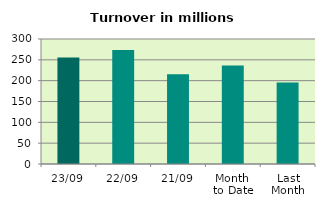
| Category | Series 0 |
|---|---|
| 23/09 | 255.417 |
| 22/09 | 273.845 |
| 21/09 | 215.668 |
| Month 
to Date | 236.651 |
| Last
Month | 195.366 |